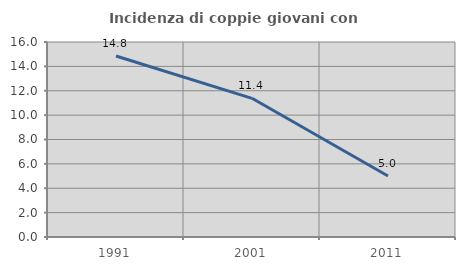
| Category | Incidenza di coppie giovani con figli |
|---|---|
| 1991.0 | 14.849 |
| 2001.0 | 11.38 |
| 2011.0 | 5 |